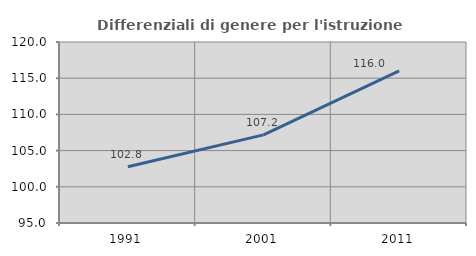
| Category | Differenziali di genere per l'istruzione superiore |
|---|---|
| 1991.0 | 102.764 |
| 2001.0 | 107.17 |
| 2011.0 | 116.023 |